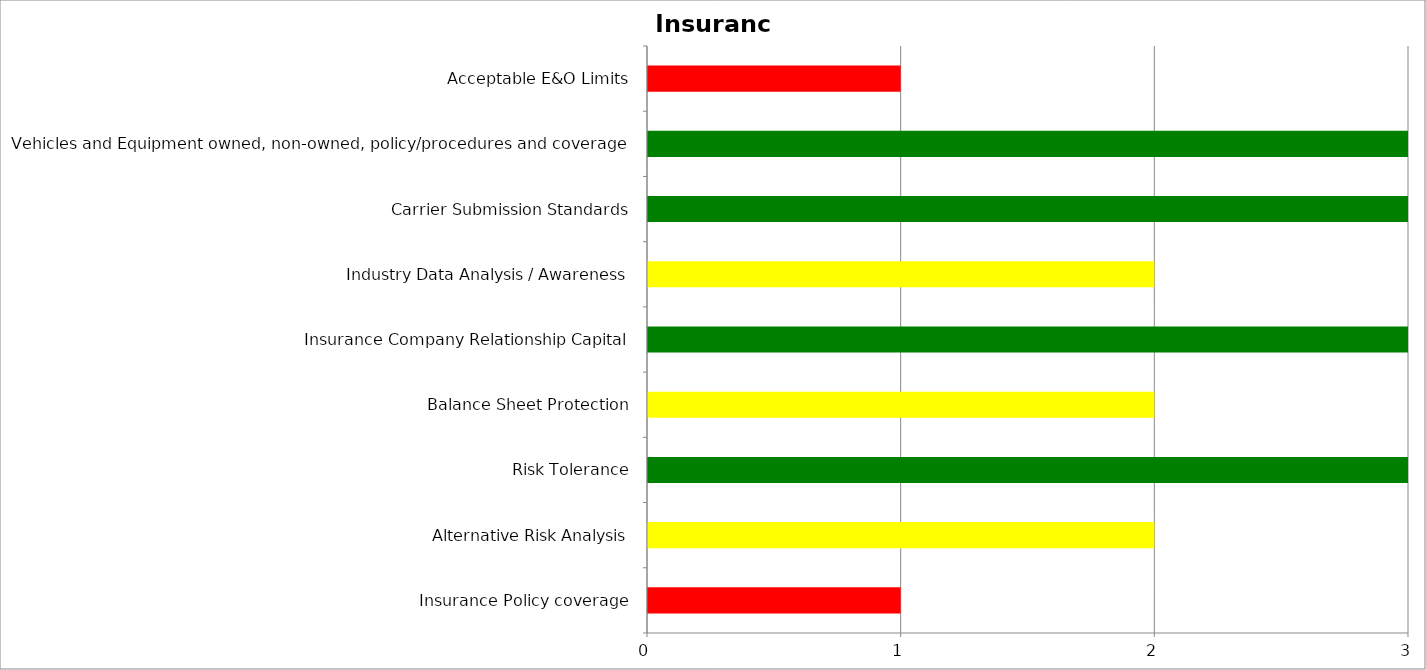
| Category | Low | Medium | High |
|---|---|---|---|
| Insurance Policy coverage | 0 | 0 | 1 |
| Alternative Risk Analysis | 0 | 2 | 0 |
| Risk Tolerance | 3 | 0 | 0 |
| Balance Sheet Protection | 0 | 2 | 0 |
| Insurance Company Relationship Capital | 3 | 0 | 0 |
| Industry Data Analysis / Awareness | 0 | 2 | 0 |
| Carrier Submission Standards | 3 | 0 | 0 |
| Vehicles and Equipment owned, non-owned, policy/procedures and coverage | 3 | 0 | 0 |
| Acceptable E&O Limits | 0 | 0 | 1 |